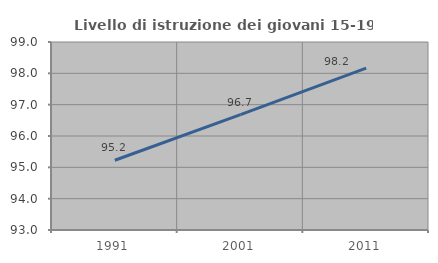
| Category | Livello di istruzione dei giovani 15-19 anni |
|---|---|
| 1991.0 | 95.226 |
| 2001.0 | 96.681 |
| 2011.0 | 98.167 |